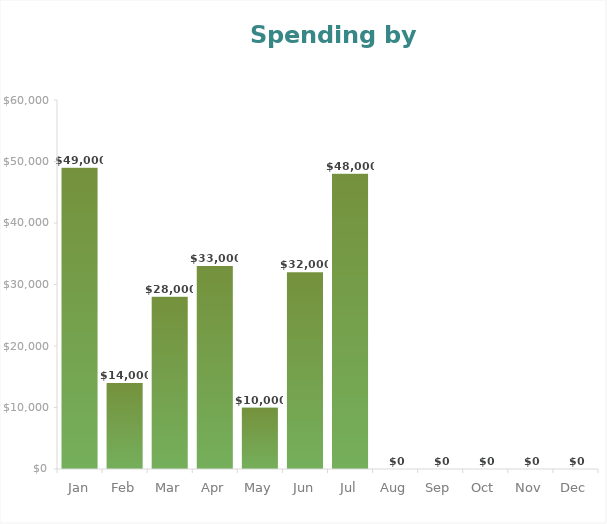
| Category | Series 11 |
|---|---|
| Jan | 49000 |
| Feb | 14000 |
| Mar | 28000 |
| Apr | 33000 |
| May | 10000 |
| Jun | 32000 |
| Jul | 48000 |
| Aug | 0 |
| Sep | 0 |
| Oct | 0 |
| Nov | 0 |
| Dec | 0 |